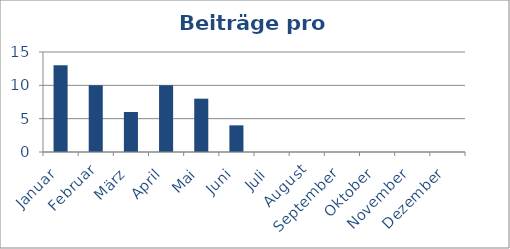
| Category | Beiträge |
|---|---|
| Januar | 13 |
| Februar | 10 |
| März | 6 |
| April | 10 |
| Mai | 8 |
| Juni | 4 |
| Juli | 0 |
| August | 0 |
| September | 0 |
| Oktober | 0 |
| November | 0 |
| Dezember | 0 |